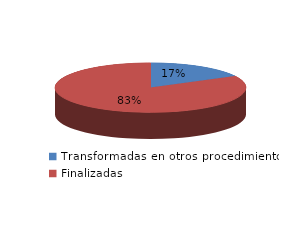
| Category | Series 0 |
|---|---|
| Transformadas en otros procedimientos | 2116 |
| Finalizadas | 10168 |